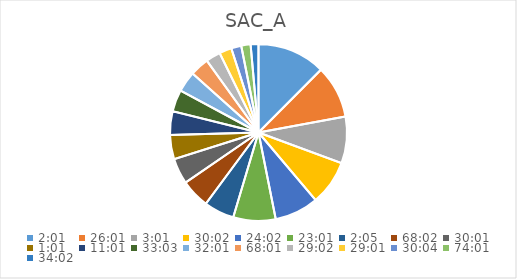
| Category | Series 0 |
|---|---|
| 0.08402777777777777 | 12.683 |
| 1.0840277777777778 | 9.813 |
| 0.12569444444444444 | 8.673 |
| 1.2513888888888889 | 8.352 |
| 1.0013888888888889 | 8.192 |
| 0.9590277777777777 | 7.873 |
| 0.08680555555555557 | 5.62 |
| 2.834722222222222 | 5.392 |
| 1.2506944444444443 | 4.789 |
| 0.042361111111111106 | 4.49 |
| 0.4590277777777778 | 4.416 |
| 1.3770833333333332 | 4.045 |
| 1.3340277777777778 | 3.824 |
| 2.8340277777777776 | 3.531 |
| 1.2097222222222224 | 2.733 |
| 1.2090277777777778 | 2.303 |
| 1.2527777777777778 | 1.876 |
| 3.0840277777777776 | 1.735 |
| 1.4180555555555554 | 1.453 |